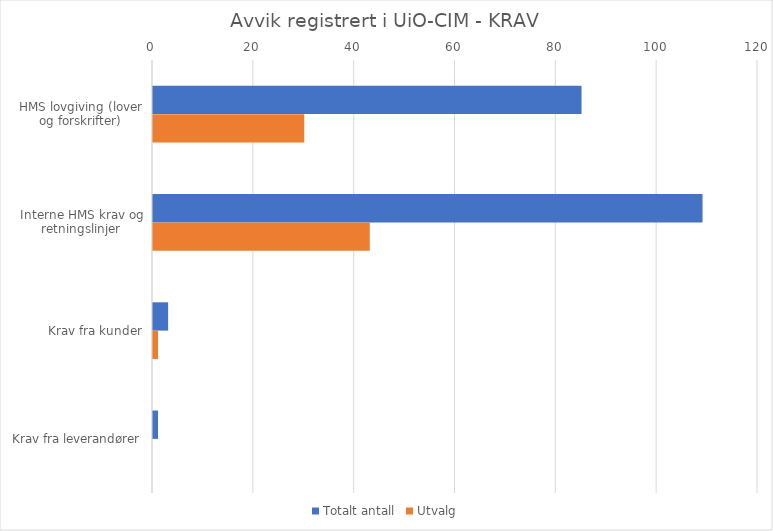
| Category | Totalt antall | Utvalg |
|---|---|---|
| HMS lovgiving (lover og forskrifter) | 85 | 30 |
| Interne HMS krav og retningslinjer | 109 | 43 |
| Krav fra kunder | 3 | 1 |
| Krav fra leverandører | 1 | 0 |